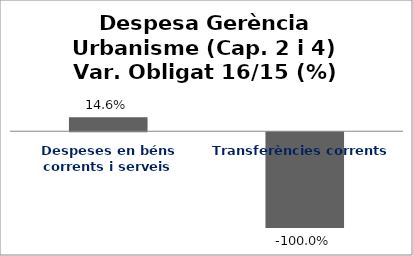
| Category | Series 0 |
|---|---|
| Despeses en béns corrents i serveis | 0.146 |
| Transferències corrents | -1 |